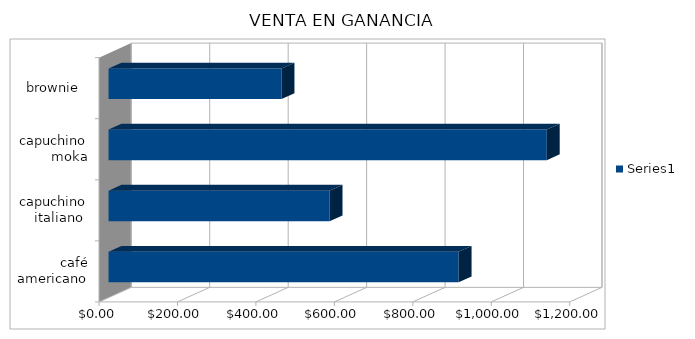
| Category | Series 0 |
|---|---|
| café americano | 892.5 |
| capuchino italiano  | 563.5 |
| capuchino moka | 1117.2 |
| brownie  | 441 |